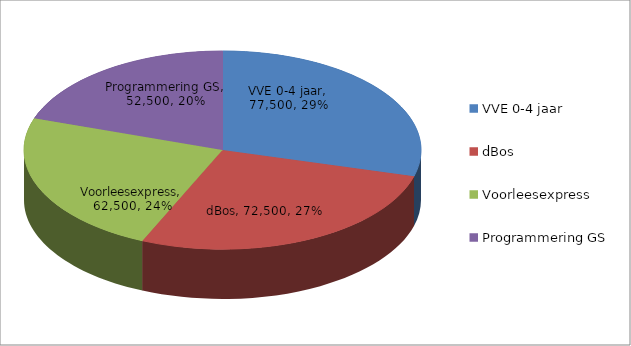
| Category | Series 0 |
|---|---|
| VVE 0-4 jaar | 77500 |
| dBos | 72500 |
| Voorleesexpress | 62500 |
| Programmering GS | 52500 |